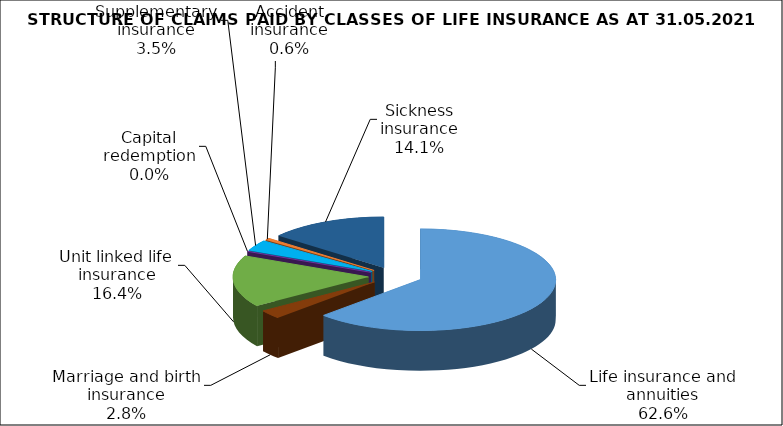
| Category | Series 0 |
|---|---|
| Life insurance and annuities | 56300617.036 |
| Marriage and birth insurance | 2480337.826 |
| Unit linked life insurance | 14762571.876 |
| Capital redemption | 0 |
| Supplementary insurance | 3108167.494 |
| Accident insurance | 554212.613 |
| Sickness insurance | 12711379.317 |